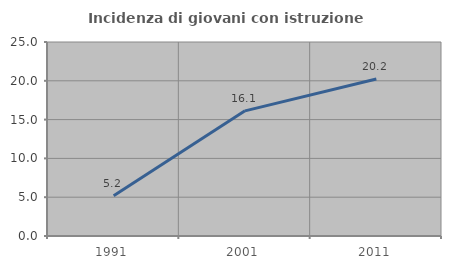
| Category | Incidenza di giovani con istruzione universitaria |
|---|---|
| 1991.0 | 5.185 |
| 2001.0 | 16.129 |
| 2011.0 | 20.225 |